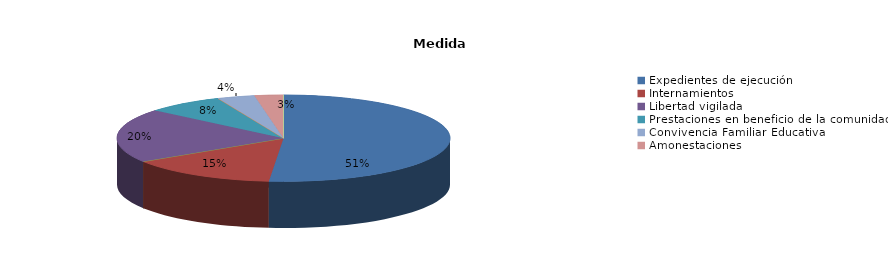
| Category | Series 0 |
|---|---|
| Expedientes de ejecución | 184 |
| Internamientos | 52 |
| Permanencias de fines de semana | 0 |
| Libertad vigilada | 72 |
| Prestaciones en beneficio de la comunidad | 27 |
| Privación de permisos y licencias | 0 |
| Convivencia Familiar Educativa | 13 |
| Amonestaciones | 10 |
| Otras | 0 |